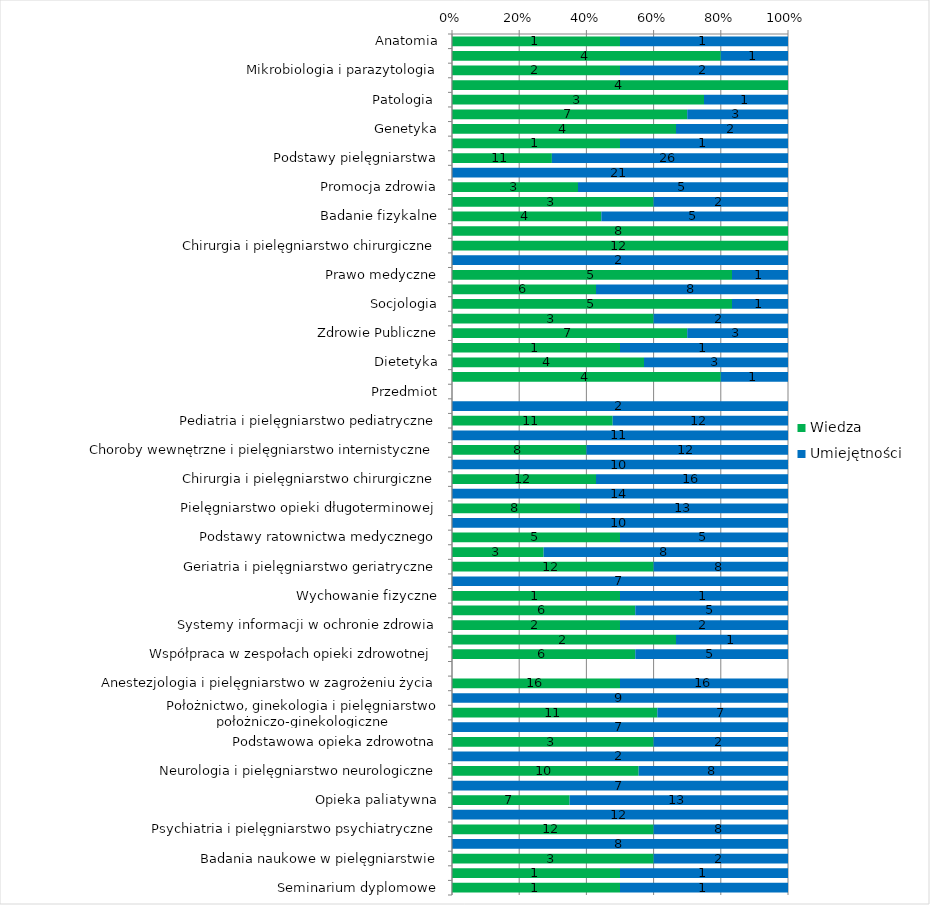
| Category | Wiedza | Umiejętności |
|---|---|---|
| Anatomia | 1 | 1 |
| Biochemia i biofizyka | 4 | 1 |
| Mikrobiologia i parazytologia | 2 | 2 |
| Fizjologia | 4 | 0 |
| Patologia  | 3 | 1 |
| Farmakologia | 7 | 3 |
| Genetyka | 4 | 2 |
| Radiologia | 1 | 1 |
| Podstawy pielęgniarstwa | 11 | 26 |
| Podstawy pielęgniarstwa - praktyka zawodowa | 0 | 21 |
| Promocja zdrowia | 3 | 5 |
| Zakażenia szpitalne | 3 | 2 |
| Badanie fizykalne | 4 | 5 |
| Choroby wewnętrzne i pielęgniarstwo internistyczne | 8 | 0 |
| Chirurgia i pielęgniarstwo chirurgiczne | 12 | 0 |
| Język angielski | 0 | 2 |
| Prawo medyczne | 5 | 1 |
| Psychologia | 6 | 8 |
| Socjologia | 5 | 1 |
| Pedagogika | 3 | 2 |
| Zdrowie Publiczne | 7 | 3 |
| Wychowanie fizyczne | 1 | 1 |
| Dietetyka | 4 | 3 |
| Etyka zawodu pielęgniarki | 4 | 1 |
| Przedmiot | 0 | 0 |
| Język angielski | 0 | 2 |
| Pediatria i pielęgniarstwo pediatryczne | 11 | 12 |
| Pediatria i pielęgniarstwo pediatryczne - praktyka zawodowa | 0 | 11 |
| Choroby wewnętrzne i pielęgniarstwo internistyczne | 8 | 12 |
| Choroby wewnętrzne i pielęgniarstwo internistyczne - praktyka zawodowa | 0 | 10 |
| Chirurgia i pielęgniarstwo chirurgiczne | 12 | 16 |
| Chirurgia i pielęgniarstwo chirurgiczne - praktyka zawodowa | 0 | 14 |
| Pielęgniarstwo opieki długoterminowej | 8 | 13 |
| Pielęgniarstwo opieki długoterminowej - praktyka zawodowa | 0 | 10 |
| Podstawy ratownictwa medycznego | 5 | 5 |
| Podstawy rehabilitacji  | 3 | 8 |
| Geriatria i pielęgniarstwo geriatryczne | 12 | 8 |
| Geriatria i pielęgniarstwo geriatryczne - praktyka zawodowa | 0 | 7 |
| Wychowanie fizyczne | 1 | 1 |
| Organizacja pracy pielęgniarskiej | 6 | 5 |
| Systemy informacji w ochronie zdrowia | 2 | 2 |
| Język migowy | 2 | 1 |
| Współpraca w zespołach opieki zdrowotnej  | 6 | 5 |
| Przedmiot | 0 | 0 |
| Anestezjologia i pielęgniarstwo w zagrożeniu życia | 16 | 16 |
| Anestezjologia i pielęgniarstwo w zagrożeniu życia - praktyka zawodowa | 0 | 9 |
| Położnictwo, ginekologia i pielęgniarstwo położniczo-ginekologiczne | 11 | 7 |
| Położnictwo, ginekologia i pielęgniarstwo położniczo-ginekologiczne - praktyka zawodowa | 0 | 7 |
| Podstawowa opieka zdrowotna | 3 | 2 |
| Podstawowa opieka zdrowotna - praktyka zawodowa | 0 | 2 |
| Neurologia i pielęgniarstwo neurologiczne | 10 | 8 |
| Neurologia i pielęgniarstwo neurologiczne - praktyka zawodowa | 0 | 7 |
| Opieka paliatywna | 7 | 13 |
| Opieka paliatywna - praktyka zawodowa | 0 | 12 |
| Psychiatria i pielęgniarstwo psychiatryczne | 12 | 8 |
| Psychiatria i pielęgniarstwo psychiatryczne - praktyka zawodowa | 0 | 8 |
| Badania naukowe w pielęgniarstwie | 3 | 2 |
| Wychowanie fizyczne | 1 | 1 |
| Seminarium dyplomowe | 1 | 1 |